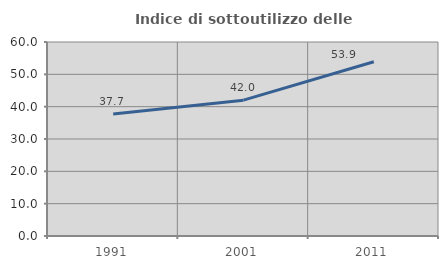
| Category | Indice di sottoutilizzo delle abitazioni  |
|---|---|
| 1991.0 | 37.705 |
| 2001.0 | 42.012 |
| 2011.0 | 53.891 |